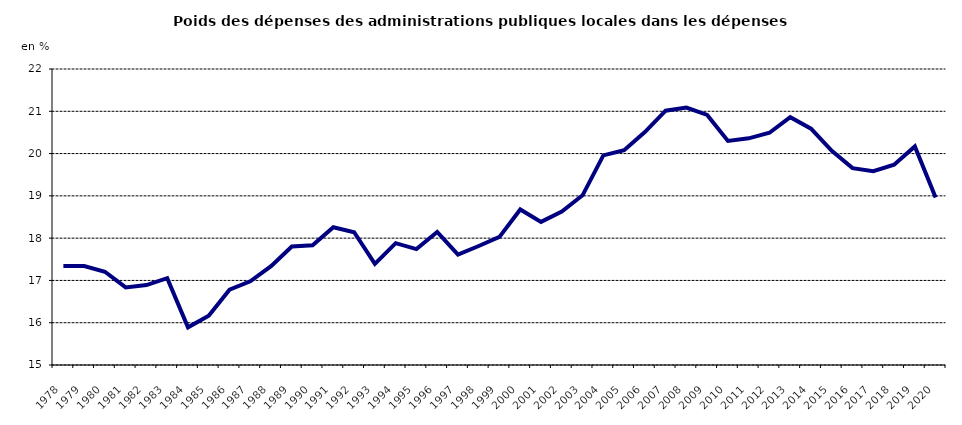
| Category | poids des dépenses des administarations publiques locales dans les administrations publiques |
|---|---|
| 1978.0 | 17.339 |
| 1979.0 | 17.341 |
| 1980.0 | 17.205 |
| 1981.0 | 16.834 |
| 1982.0 | 16.891 |
| 1983.0 | 17.054 |
| 1984.0 | 15.892 |
| 1985.0 | 16.168 |
| 1986.0 | 16.782 |
| 1987.0 | 16.979 |
| 1988.0 | 17.336 |
| 1989.0 | 17.802 |
| 1990.0 | 17.83 |
| 1991.0 | 18.256 |
| 1992.0 | 18.141 |
| 1993.0 | 17.39 |
| 1994.0 | 17.882 |
| 1995.0 | 17.74 |
| 1996.0 | 18.145 |
| 1997.0 | 17.609 |
| 1998.0 | 17.814 |
| 1999.0 | 18.03 |
| 2000.0 | 18.679 |
| 2001.0 | 18.384 |
| 2002.0 | 18.63 |
| 2003.0 | 19.013 |
| 2004.0 | 19.956 |
| 2005.0 | 20.078 |
| 2006.0 | 20.507 |
| 2007.0 | 21.014 |
| 2008.0 | 21.088 |
| 2009.0 | 20.914 |
| 2010.0 | 20.299 |
| 2011.0 | 20.36 |
| 2012.0 | 20.493 |
| 2013.0 | 20.86 |
| 2014.0 | 20.59 |
| 2015.0 | 20.065 |
| 2016.0 | 19.656 |
| 2017.0 | 19.585 |
| 2018.0 | 19.735 |
| 2019.0 | 20.169 |
| 2020.0 | 18.963 |